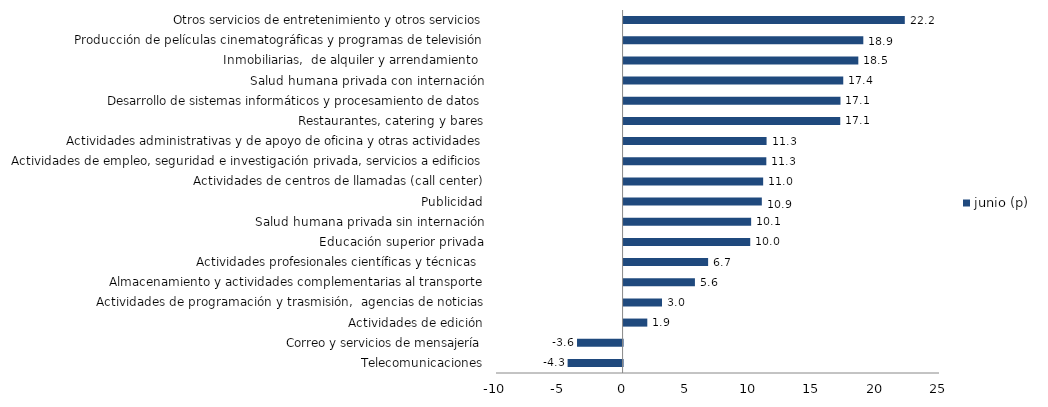
| Category | junio (p) |
|---|---|
| Telecomunicaciones | -4.342 |
| Correo y servicios de mensajería | -3.6 |
| Actividades de edición | 1.875 |
| Actividades de programación y trasmisión,  agencias de noticias | 3.036 |
| Almacenamiento y actividades complementarias al transporte | 5.638 |
| Actividades profesionales científicas y técnicas  | 6.68 |
| Educación superior privada | 10.008 |
| Salud humana privada sin internación | 10.078 |
| Publicidad | 10.923 |
| Actividades de centros de llamadas (call center) | 11.029 |
| Actividades de empleo, seguridad e investigación privada, servicios a edificios | 11.279 |
| Actividades administrativas y de apoyo de oficina y otras actividades | 11.299 |
| Restaurantes, catering y bares | 17.12 |
| Desarrollo de sistemas informáticos y procesamiento de datos | 17.137 |
| Salud humana privada con internación | 17.357 |
| Inmobiliarias,  de alquiler y arrendamiento  | 18.546 |
| Producción de películas cinematográficas y programas de televisión | 18.942 |
| Otros servicios de entretenimiento y otros servicios | 22.219 |